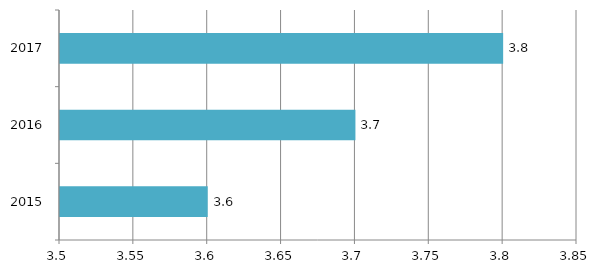
| Category | Series 0 |
|---|---|
| 2015.0 | 3.6 |
| 2016.0 | 3.7 |
| 2017.0 | 3.8 |